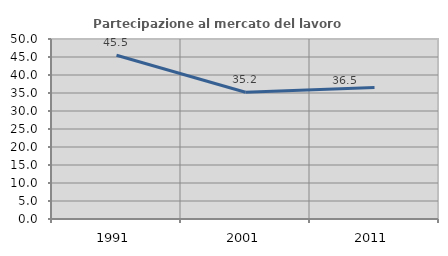
| Category | Partecipazione al mercato del lavoro  femminile |
|---|---|
| 1991.0 | 45.478 |
| 2001.0 | 35.199 |
| 2011.0 | 36.508 |